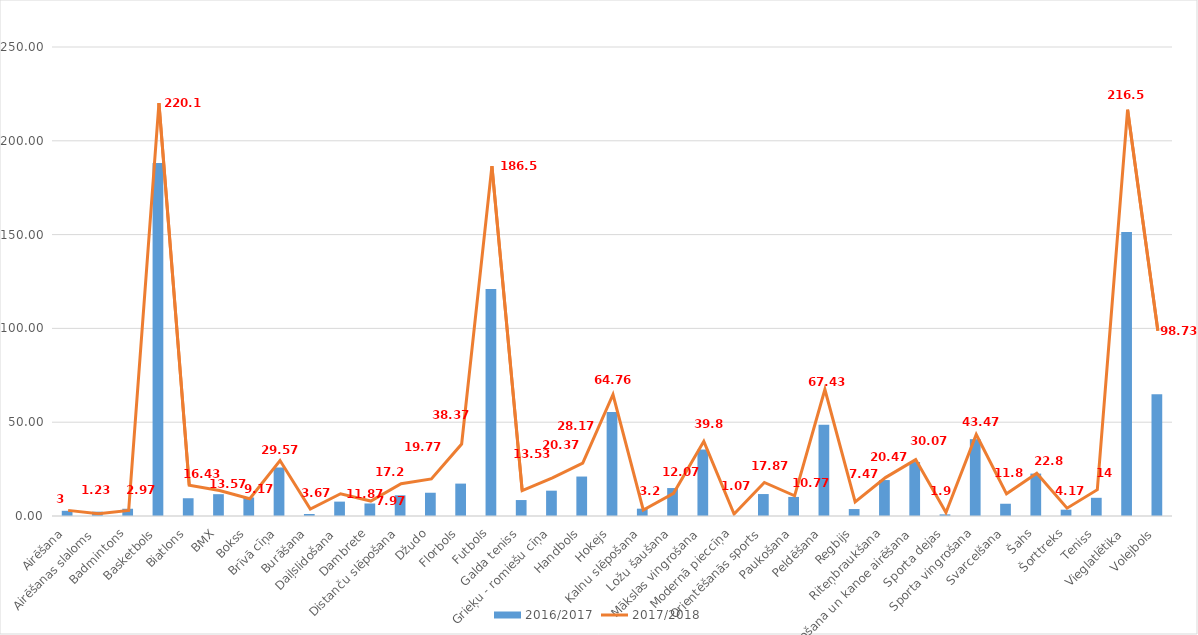
| Category | 2016/2017 |
|---|---|
| Airēšana | 2.767 |
| Airēšanas slaloms | 2.3 |
| Badmintons | 3.867 |
| Basketbols | 188.195 |
| Biatlons | 9.467 |
| BMX | 11.633 |
| Bokss | 9.867 |
| Brīvā cīņa | 25.853 |
| Burāšana | 1.067 |
| Daiļslidošana | 7.667 |
| Dambrete | 6.667 |
| Distanču slēpošana | 11.033 |
| Džudo | 12.4 |
| Florbols | 17.27 |
| Futbols | 121.067 |
| Galda teniss | 8.504 |
| Grieķu - romiešu cīņa | 13.5 |
| Handbols | 21.033 |
| Hokejs | 55.467 |
| Kalnu slēpošana | 3.9 |
| Ložu šaušana | 14.9 |
| Mākslas vingrošana | 35.433 |
| Modernā pieccīņa | 0 |
| Orientēšanās sports | 11.7 |
| Paukošana | 10.167 |
| Peldēšana | 48.633 |
| Regbijs | 3.71 |
| Riteņbraukšana | 19.157 |
| Smaiļošana un kanoe airēšana | 28.767 |
| Sporta dejas | 0.867 |
| Sporta vingrošana | 40.967 |
| Svarcelšana | 6.533 |
| Šahs | 22.6 |
| Šorttreks | 3.367 |
| Teniss | 9.7 |
| Vieglatlētika | 151.321 |
| Volejbols | 64.858 |